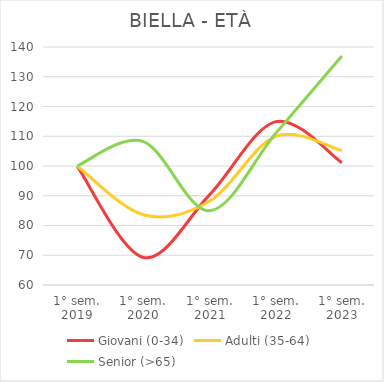
| Category | Giovani (0-34) | Adulti (35-64) | Senior (>65) |
|---|---|---|---|
| 1° sem.
2019 | 100 | 100 | 100 |
| 1° sem.
2020 | 69.262 | 83.614 | 108.219 |
| 1° sem.
2021 | 90.306 | 88.155 | 84.932 |
| 1° sem.
2022 | 114.916 | 109.971 | 110.959 |
| 1° sem.
2023 | 101.126 | 105.176 | 136.986 |